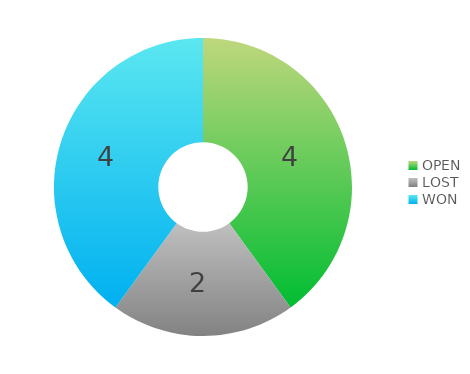
| Category | Series 0 |
|---|---|
| OPEN | 4 |
| LOST | 2 |
| WON | 4 |